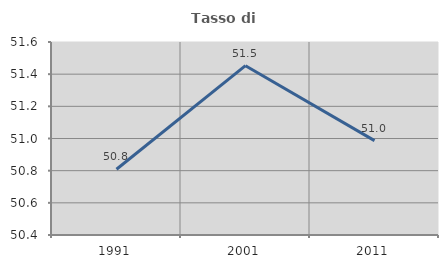
| Category | Tasso di occupazione   |
|---|---|
| 1991.0 | 50.809 |
| 2001.0 | 51.453 |
| 2011.0 | 50.987 |